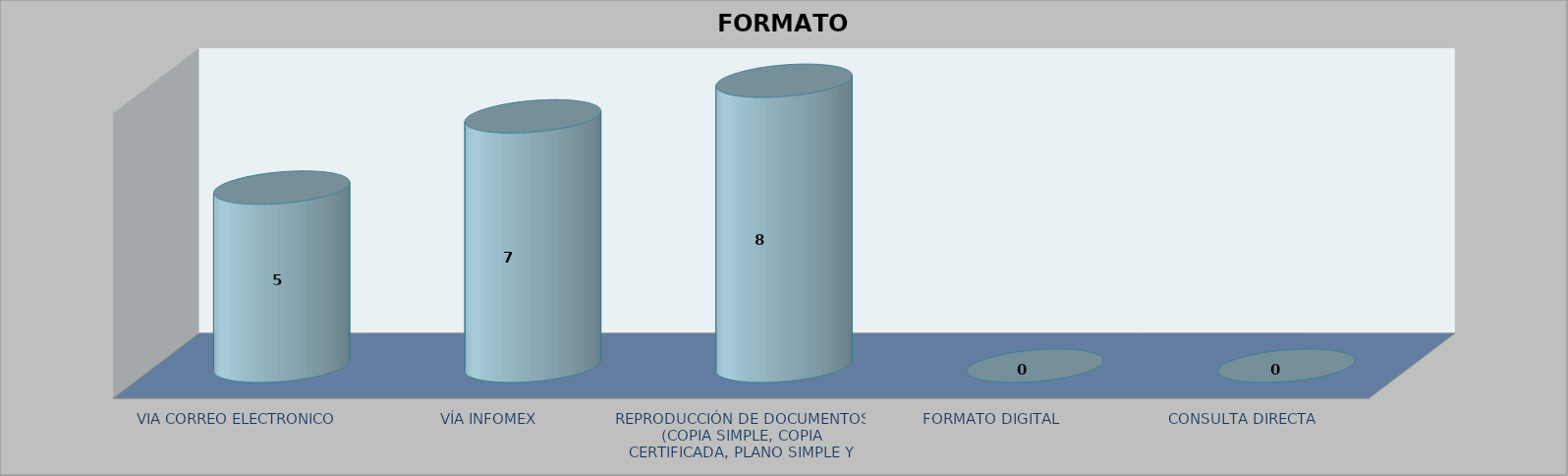
| Category |        FORMATO SOLICITADO | Series 1 | Series 2 |
|---|---|---|---|
| VIA CORREO ELECTRONICO |  |  | 5 |
| VÍA INFOMEX |  |  | 7 |
| REPRODUCCIÓN DE DOCUMENTOS (COPIA SIMPLE, COPIA CERTIFICADA, PLANO SIMPLE Y PLANO CERTIFICADO) |  |  | 8 |
| FORMATO DIGITAL |  |  | 0 |
| CONSULTA DIRECTA |  |  | 0 |